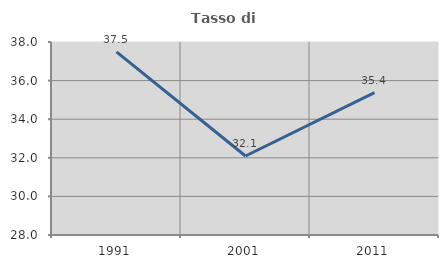
| Category | Tasso di occupazione   |
|---|---|
| 1991.0 | 37.492 |
| 2001.0 | 32.094 |
| 2011.0 | 35.377 |